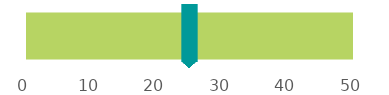
| Category | Top Conditions Opioids are Most Prescribed For | Condition |      Low Back Pain |
|---|---|---|---|
| 0 |  | 0 | 50 |